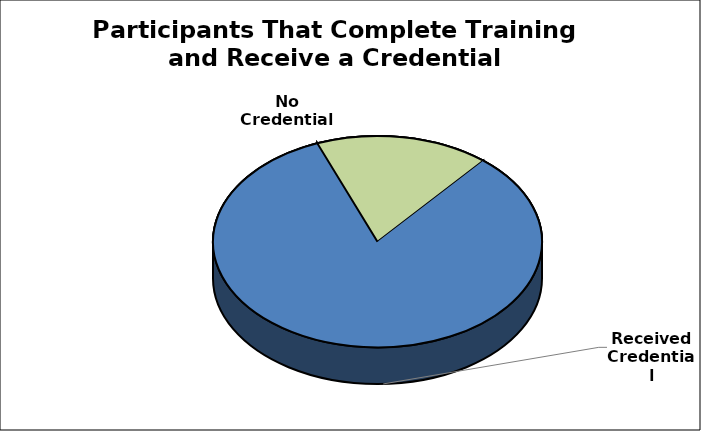
| Category | Series 0 |
|---|---|
| Received Credential | 68 |
| No Credential | 14 |